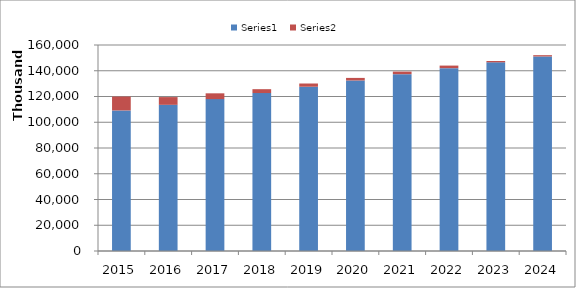
| Category | Series 0 | Series 1 |
|---|---|---|
| 2015.0 | 109167730 | 10787578 |
| 2016.0 | 113538641 | 6000000 |
| 2017.0 | 117966648 | 4500000 |
| 2018.0 | 122685314 | 3000000 |
| 2019.0 | 127592727 | 2500000 |
| 2020.0 | 132441251 | 2000000 |
| 2021.0 | 137341577 | 2000000 |
| 2022.0 | 142011191 | 2000000 |
| 2023.0 | 146555549 | 1000000 |
| 2024.0 | 151098771 | 1000000 |